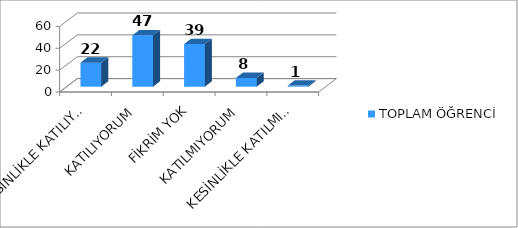
| Category | TOPLAM ÖĞRENCİ |
|---|---|
| KESİNLİKLE KATILIYORUM | 22 |
| KATILIYORUM | 47 |
| FİKRİM YOK | 39 |
| KATILMIYORUM | 8 |
| KESİNLİKLE KATILMIYORUM | 1 |